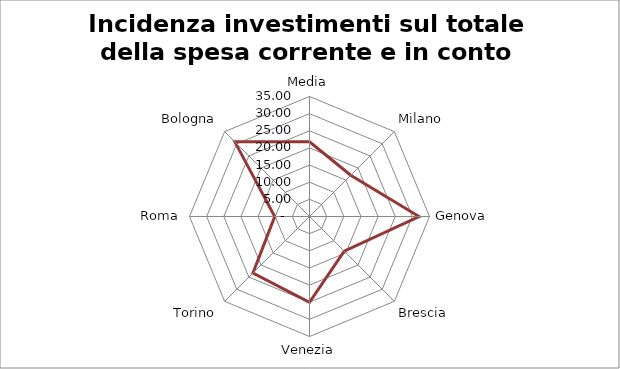
| Category | Incidenza investimenti sul totale della spesa corrente e in conto capitale |
|---|---|
| Media | 21.794 |
| Milano | 17 |
| Genova | 31.95 |
| Brescia | 14.32 |
| Venezia | 25.04 |
| Torino | 23.32 |
| Roma | 10.14 |
| Bologna | 30.79 |